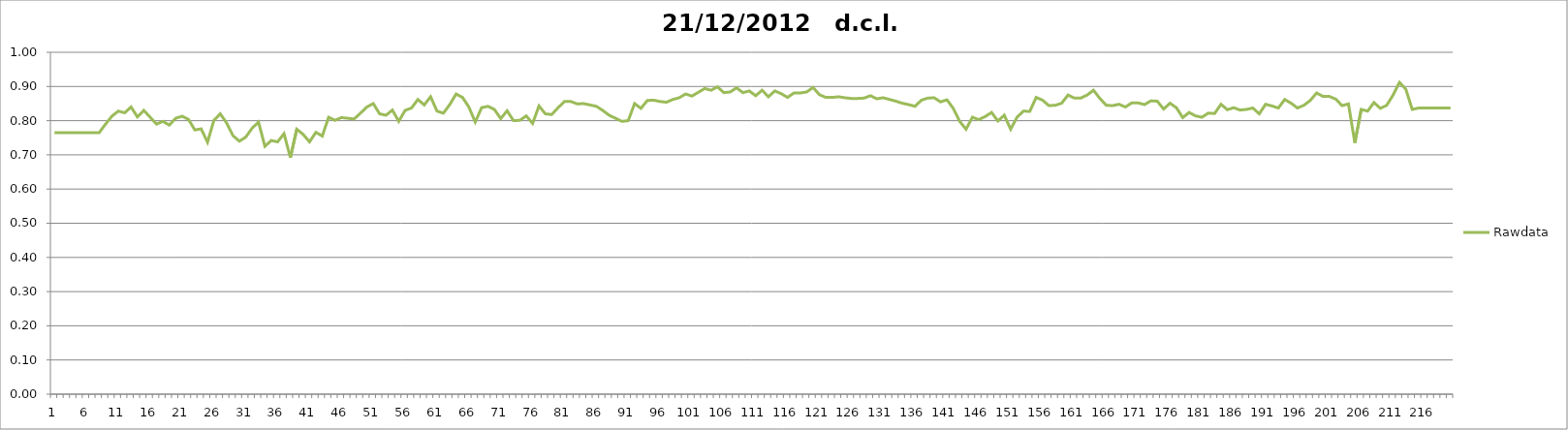
| Category | Rawdata |
|---|---|
| 0 | 0.765 |
| 1 | 0.765 |
| 2 | 0.765 |
| 3 | 0.765 |
| 4 | 0.765 |
| 5 | 0.765 |
| 6 | 0.765 |
| 7 | 0.765 |
| 8 | 0.79 |
| 9 | 0.813 |
| 10 | 0.828 |
| 11 | 0.823 |
| 12 | 0.84 |
| 13 | 0.811 |
| 14 | 0.83 |
| 15 | 0.81 |
| 16 | 0.79 |
| 17 | 0.798 |
| 18 | 0.787 |
| 19 | 0.807 |
| 20 | 0.813 |
| 21 | 0.804 |
| 22 | 0.773 |
| 23 | 0.776 |
| 24 | 0.737 |
| 25 | 0.801 |
| 26 | 0.82 |
| 27 | 0.793 |
| 28 | 0.756 |
| 29 | 0.74 |
| 30 | 0.752 |
| 31 | 0.778 |
| 32 | 0.796 |
| 33 | 0.725 |
| 34 | 0.742 |
| 35 | 0.738 |
| 36 | 0.762 |
| 37 | 0.692 |
| 38 | 0.775 |
| 39 | 0.76 |
| 40 | 0.738 |
| 41 | 0.766 |
| 42 | 0.755 |
| 43 | 0.81 |
| 44 | 0.801 |
| 45 | 0.809 |
| 46 | 0.807 |
| 47 | 0.805 |
| 48 | 0.822 |
| 49 | 0.84 |
| 50 | 0.85 |
| 51 | 0.82 |
| 52 | 0.816 |
| 53 | 0.831 |
| 54 | 0.798 |
| 55 | 0.83 |
| 56 | 0.837 |
| 57 | 0.862 |
| 58 | 0.846 |
| 59 | 0.87 |
| 60 | 0.828 |
| 61 | 0.822 |
| 62 | 0.847 |
| 63 | 0.878 |
| 64 | 0.868 |
| 65 | 0.84 |
| 66 | 0.796 |
| 67 | 0.838 |
| 68 | 0.842 |
| 69 | 0.833 |
| 70 | 0.806 |
| 71 | 0.829 |
| 72 | 0.8 |
| 73 | 0.801 |
| 74 | 0.814 |
| 75 | 0.792 |
| 76 | 0.843 |
| 77 | 0.82 |
| 78 | 0.818 |
| 79 | 0.838 |
| 80 | 0.856 |
| 81 | 0.856 |
| 82 | 0.849 |
| 83 | 0.85 |
| 84 | 0.846 |
| 85 | 0.842 |
| 86 | 0.83 |
| 87 | 0.816 |
| 88 | 0.807 |
| 89 | 0.798 |
| 90 | 0.8 |
| 91 | 0.85 |
| 92 | 0.836 |
| 93 | 0.859 |
| 94 | 0.86 |
| 95 | 0.856 |
| 96 | 0.854 |
| 97 | 0.862 |
| 98 | 0.867 |
| 99 | 0.878 |
| 100 | 0.872 |
| 101 | 0.883 |
| 102 | 0.894 |
| 103 | 0.889 |
| 104 | 0.899 |
| 105 | 0.882 |
| 106 | 0.884 |
| 107 | 0.896 |
| 108 | 0.882 |
| 109 | 0.887 |
| 110 | 0.873 |
| 111 | 0.889 |
| 112 | 0.87 |
| 113 | 0.887 |
| 114 | 0.879 |
| 115 | 0.868 |
| 116 | 0.881 |
| 117 | 0.881 |
| 118 | 0.884 |
| 119 | 0.897 |
| 120 | 0.876 |
| 121 | 0.868 |
| 122 | 0.868 |
| 123 | 0.87 |
| 124 | 0.867 |
| 125 | 0.865 |
| 126 | 0.865 |
| 127 | 0.866 |
| 128 | 0.873 |
| 129 | 0.864 |
| 130 | 0.867 |
| 131 | 0.862 |
| 132 | 0.857 |
| 133 | 0.851 |
| 134 | 0.847 |
| 135 | 0.842 |
| 136 | 0.86 |
| 137 | 0.866 |
| 138 | 0.867 |
| 139 | 0.855 |
| 140 | 0.861 |
| 141 | 0.836 |
| 142 | 0.798 |
| 143 | 0.775 |
| 144 | 0.81 |
| 145 | 0.803 |
| 146 | 0.812 |
| 147 | 0.824 |
| 148 | 0.799 |
| 149 | 0.816 |
| 150 | 0.775 |
| 151 | 0.81 |
| 152 | 0.828 |
| 153 | 0.827 |
| 154 | 0.868 |
| 155 | 0.86 |
| 156 | 0.844 |
| 157 | 0.845 |
| 158 | 0.851 |
| 159 | 0.875 |
| 160 | 0.866 |
| 161 | 0.866 |
| 162 | 0.875 |
| 163 | 0.889 |
| 164 | 0.865 |
| 165 | 0.845 |
| 166 | 0.844 |
| 167 | 0.848 |
| 168 | 0.84 |
| 169 | 0.852 |
| 170 | 0.852 |
| 171 | 0.847 |
| 172 | 0.858 |
| 173 | 0.857 |
| 174 | 0.834 |
| 175 | 0.851 |
| 176 | 0.838 |
| 177 | 0.809 |
| 178 | 0.824 |
| 179 | 0.814 |
| 180 | 0.81 |
| 181 | 0.822 |
| 182 | 0.821 |
| 183 | 0.848 |
| 184 | 0.832 |
| 185 | 0.838 |
| 186 | 0.831 |
| 187 | 0.833 |
| 188 | 0.837 |
| 189 | 0.82 |
| 190 | 0.848 |
| 191 | 0.843 |
| 192 | 0.837 |
| 193 | 0.862 |
| 194 | 0.851 |
| 195 | 0.837 |
| 196 | 0.845 |
| 197 | 0.859 |
| 198 | 0.881 |
| 199 | 0.871 |
| 200 | 0.871 |
| 201 | 0.863 |
| 202 | 0.844 |
| 203 | 0.849 |
| 204 | 0.735 |
| 205 | 0.833 |
| 206 | 0.828 |
| 207 | 0.853 |
| 208 | 0.836 |
| 209 | 0.845 |
| 210 | 0.875 |
| 211 | 0.912 |
| 212 | 0.892 |
| 213 | 0.833 |
| 214 | 0.837 |
| 215 | 0.837 |
| 216 | 0.837 |
| 217 | 0.837 |
| 218 | 0.837 |
| 219 | 0.837 |